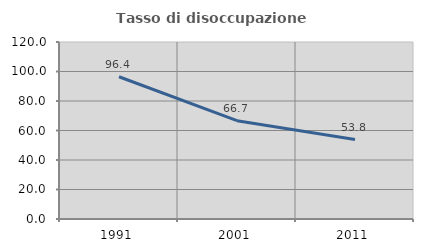
| Category | Tasso di disoccupazione giovanile  |
|---|---|
| 1991.0 | 96.429 |
| 2001.0 | 66.667 |
| 2011.0 | 53.846 |